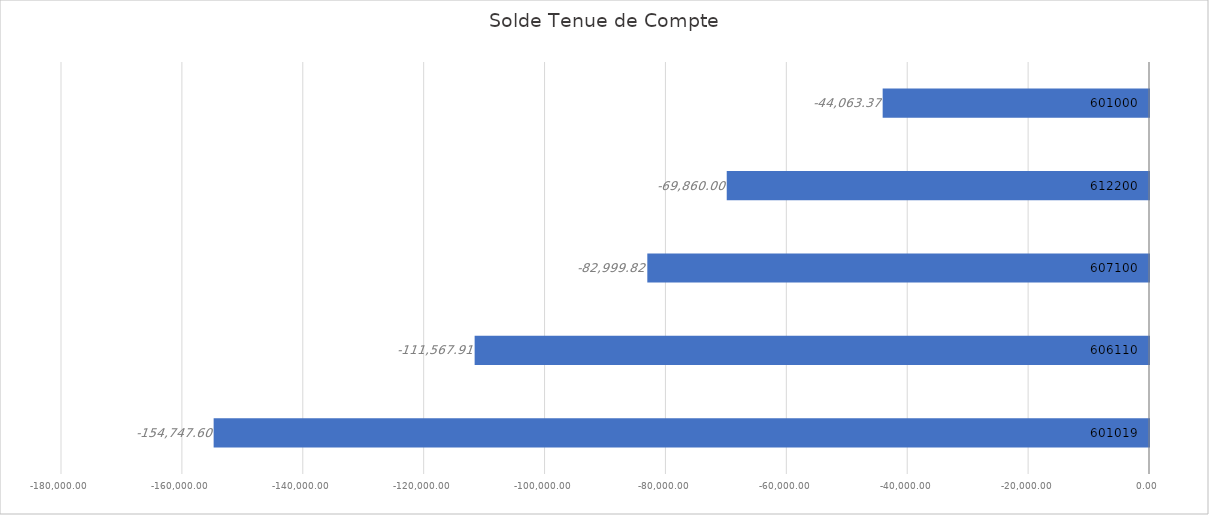
| Category | Solde Tenue de Compte |
|---|---|
| 601019 | -154747.6 |
| 606110 | -111567.91 |
| 607100 | -82999.82 |
| 612200 | -69860 |
| 601000 | -44063.37 |